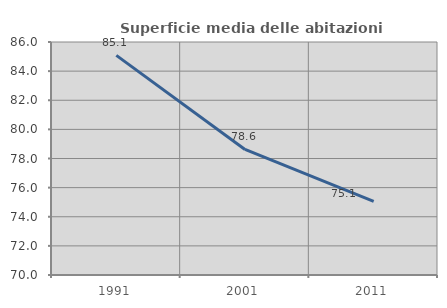
| Category | Superficie media delle abitazioni occupate |
|---|---|
| 1991.0 | 85.079 |
| 2001.0 | 78.619 |
| 2011.0 | 75.06 |